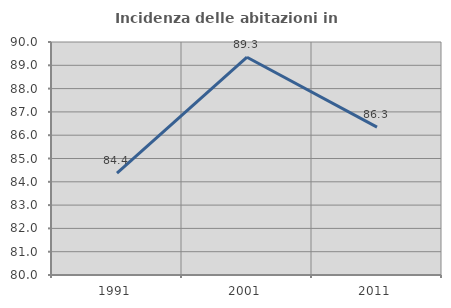
| Category | Incidenza delle abitazioni in proprietà  |
|---|---|
| 1991.0 | 84.375 |
| 2001.0 | 89.347 |
| 2011.0 | 86.348 |